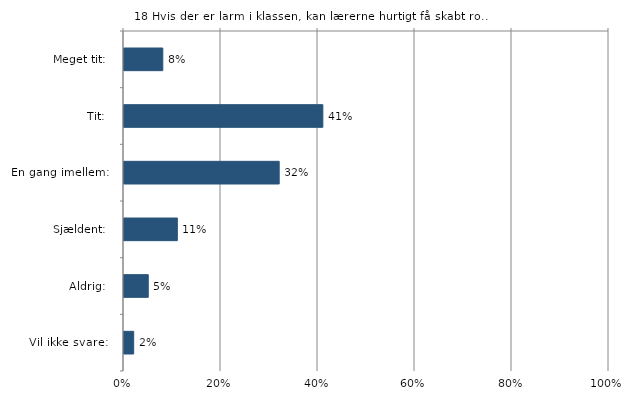
| Category | Hvis der er larm i klassen, kan lærerne hurtigt få skabt ro. |
|---|---|
| Meget tit:   | 0.08 |
| Tit:   | 0.41 |
| En gang imellem:   | 0.32 |
| Sjældent:   | 0.11 |
| Aldrig:   | 0.05 |
| Vil ikke svare:   | 0.02 |